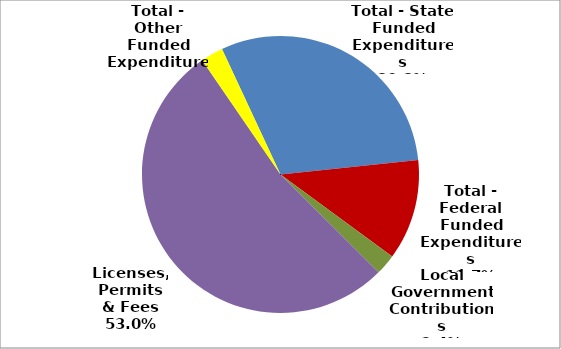
| Category | Series 0 |
|---|---|
| Total - State Funded Expenditures | 1268076 |
| Total - Federal Funded Expenditures | 491721 |
| Local Government Contributions | 101251 |
| Licenses, Permits & Fees | 2217831 |
| Total - Other Funded Expenditures | 109830 |